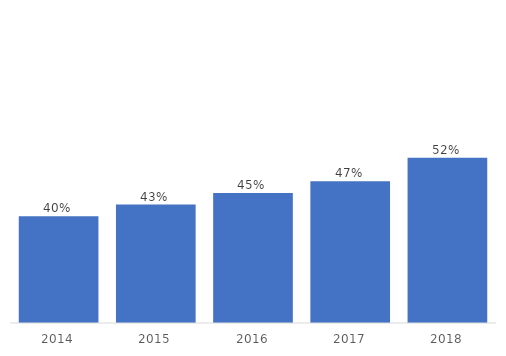
| Category | % Female |
|---|---|
| 2014.0 | 0.404 |
| 2015.0 | 0.427 |
| 2016.0 | 0.449 |
| 2017.0 | 0.472 |
| 2018.0 | 0.517 |